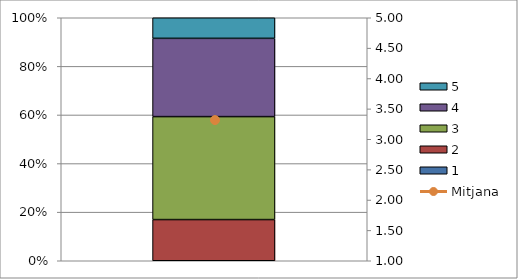
| Category | 1 | 2 | 3 | 4 | 5 |
|---|---|---|---|---|---|
| 0 | 0 | 10 | 25 | 19 | 5 |